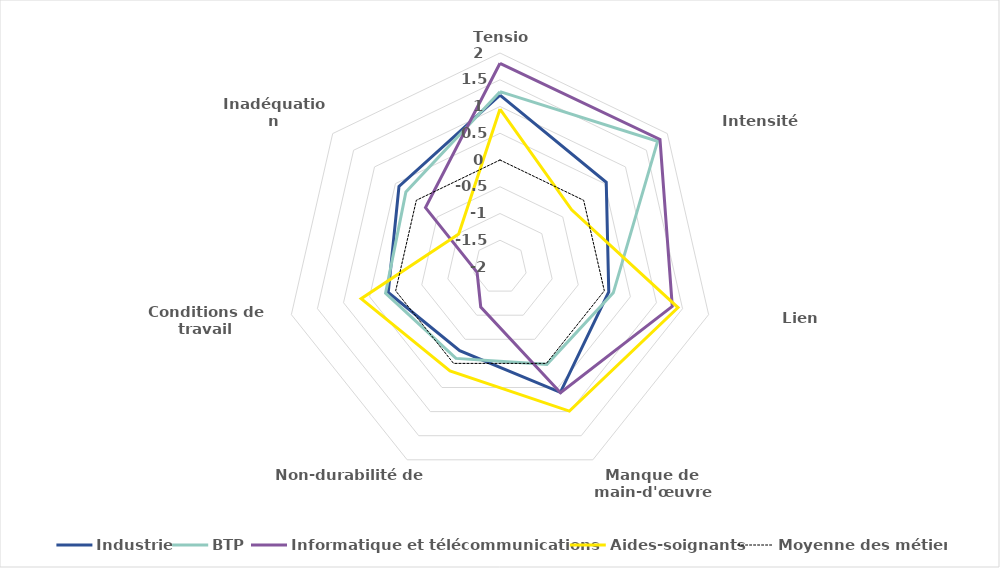
| Category | Industrie | BTP | Informatique et télécommunications | Aides-soignants | Moyenne des métiers |
|---|---|---|---|---|---|
| Tension | 1.211 | 1.277 | 1.808 | 0.952 | 0 |
| Intensité d'embauches | 0.54 | 1.768 | 1.825 | -0.287 | 0 |
| Lien formation-emploi | 0.085 | 0.172 | 1.303 | 1.413 | 0 |
| Manque de main-d'œuvre disponible | 0.601 | 0.02 | 0.607 | 0.99 | 0 |
| Non-durabilité de l'emploi | -0.264 | -0.104 | -1.17 | 0.156 | 0 |
| Conditions de travail contraignantes | 0.143 | 0.194 | -1.561 | 0.662 | 0 |
| Inadéquation géographique | 0.415 | 0.25 | -0.219 | -1.013 | 0 |